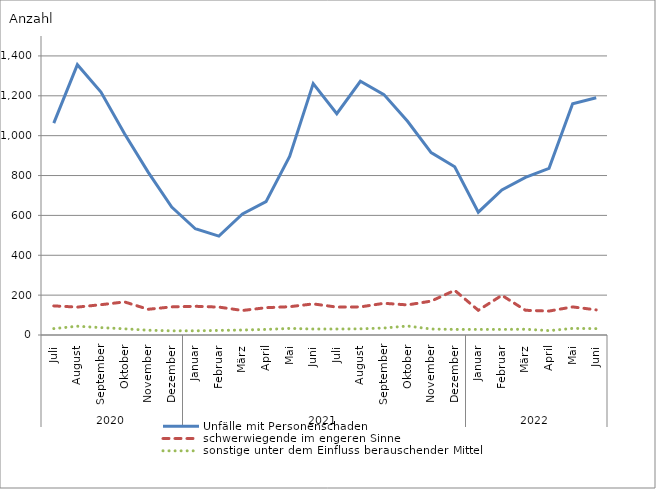
| Category | Unfälle mit Personenschaden | schwerwiegende im engeren Sinne | sonstige unter dem Einfluss berauschender Mittel |
|---|---|---|---|
| 0 | 1063 | 146 | 32 |
| 1 | 1356 | 140 | 44 |
| 2 | 1219 | 152 | 37 |
| 3 | 1010 | 166 | 31 |
| 4 | 817 | 129 | 24 |
| 5 | 642 | 141 | 21 |
| 6 | 533 | 144 | 21 |
| 7 | 496 | 140 | 23 |
| 8 | 607 | 123 | 25 |
| 9 | 669 | 137 | 28 |
| 10 | 896 | 142 | 33 |
| 11 | 1261 | 156 | 30 |
| 12 | 1110 | 140 | 30 |
| 13 | 1273 | 141 | 31 |
| 14 | 1206 | 159 | 35 |
| 15 | 1072 | 151 | 45 |
| 16 | 915 | 170 | 30 |
| 17 | 844 | 224 | 28 |
| 18 | 616 | 124 | 28 |
| 19 | 728 | 199 | 28 |
| 20 | 791 | 124 | 29 |
| 21 | 836 | 120 | 22 |
| 22 | 1160 | 141 | 33 |
| 23 | 1190 | 126 | 32 |